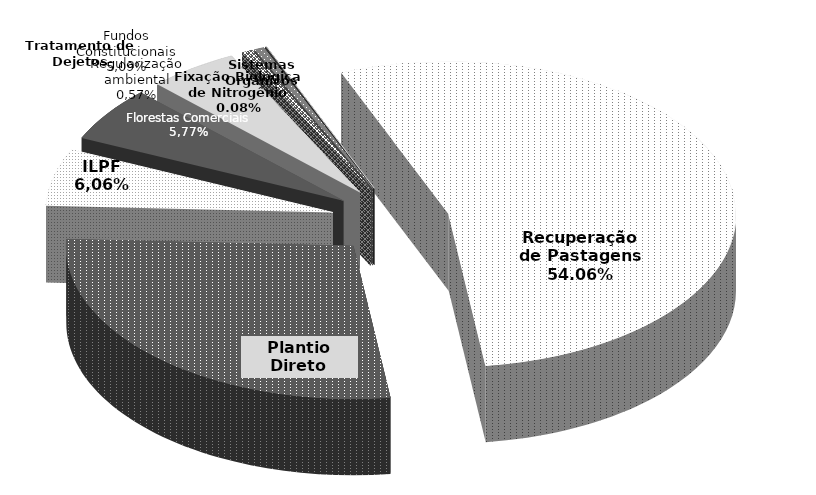
| Category | Valor (R$ mihões) | Nº Contratos |
|---|---|---|
| Recuperação de Pastagens | 1277298772.86 | 4689 |
| Plantio Direto | 655881204.9 | 1302 |
| Integração Lavoura-Pecuária-Floresta | 143095877.64 | 378 |
| Florestas Comerciais | 136280988.55 | 326 |
| Financiamentos om recursos dos Fundos Constitucionais | 120378425.66 | 219 |
| Tratamento de Dejetos | 14245180.85 | 37 |
| Regularização e adequação ambiental | 13444626.83 | 42 |
| Fixação Biológica de Nitrogênio | 2000000 | 1 |
| Sistemas Orgânicos | 183600 | 4 |